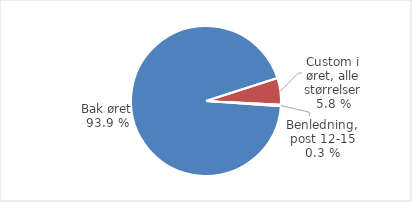
| Category | Series 0 |
|---|---|
| Bak øret | 93333 |
| Custom i øret, alle størrelser | 5718 |
| Benledning, post 12-15 | 299 |